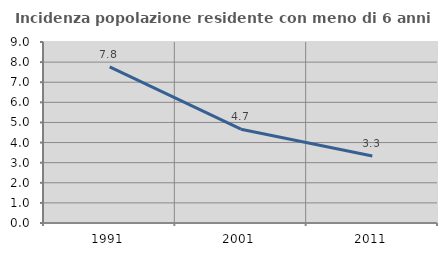
| Category | Incidenza popolazione residente con meno di 6 anni |
|---|---|
| 1991.0 | 7.768 |
| 2001.0 | 4.666 |
| 2011.0 | 3.33 |